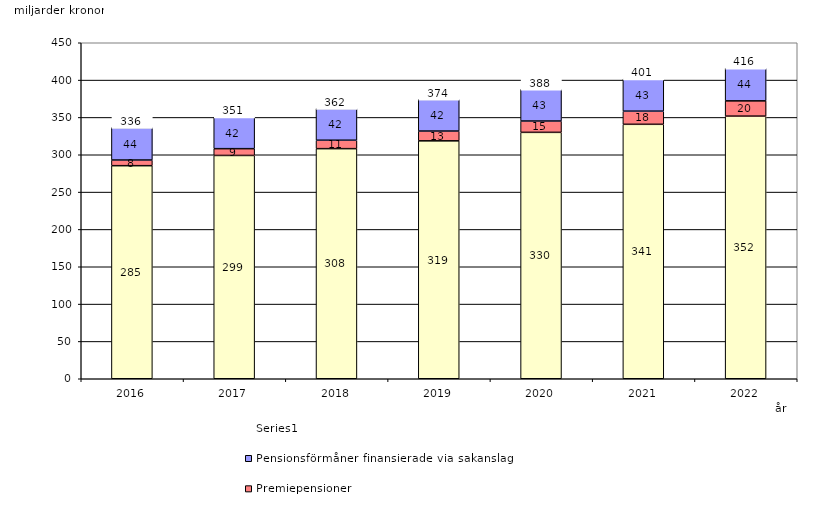
| Category | Inkomstpension och tilläggspension m.m. | Premiepensioner | Pensionsförmåner finansierade via sakanslag | Series 0 |
|---|---|---|---|---|
| 2016.0 | 285.357 | 7.598 | 43.541 | 20 |
| 2017.0 | 299.068 | 9.085 | 42.487 | 20 |
| 2018.0 | 308.164 | 11.317 | 42.48 | 20 |
| 2019.0 | 318.628 | 13.124 | 42.482 | 20 |
| 2020.0 | 330.002 | 15.187 | 42.524 | 20 |
| 2021.0 | 340.767 | 17.619 | 43.048 | 20 |
| 2022.0 | 351.714 | 20.471 | 43.688 | 20 |